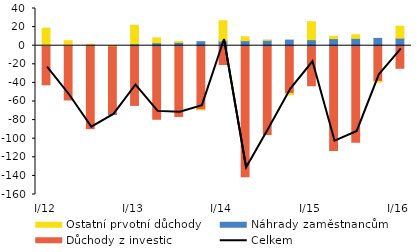
| Category | Důchody z investic | Náhrady zaměstnancům | Ostatní prvotní důchody |
|---|---|---|---|
| I/12 | -41.994 | 0.227 | 18.684 |
| II | -58.363 | 0.336 | 5.046 |
| III | -89.224 | 1.034 | 0.625 |
| IV | -73.825 | -0.116 | 0.042 |
| I/13 | -64.207 | 1.936 | 19.989 |
| II | -79.099 | 3.108 | 5.367 |
| III | -76.077 | 3.539 | 0.9 |
| IV | -68.775 | 4.321 | -0.021 |
| I/14 | -20.193 | 5.021 | 21.825 |
| II | -140.87 | 5.405 | 4.194 |
| III | -95.441 | 5.79 | 0.166 |
| IV | -51.417 | 6.025 | -1.284 |
| I/15 | -43.078 | 6.452 | 19.364 |
| II | -112.759 | 7.619 | 2.466 |
| III | -103.914 | 7.842 | 3.856 |
| IV | -38.326 | 7.856 | -0.894 |
| I/16 | -24.27 | 8.159 | 12.77 |